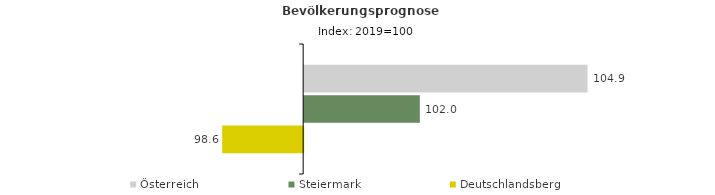
| Category | Österreich | Steiermark | Deutschlandsberg |
|---|---|---|---|
| 2019.0 | 104.9 | 102 | 98.6 |